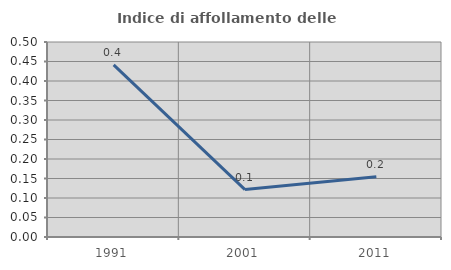
| Category | Indice di affollamento delle abitazioni  |
|---|---|
| 1991.0 | 0.442 |
| 2001.0 | 0.122 |
| 2011.0 | 0.154 |